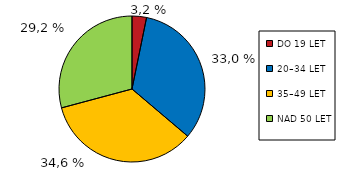
| Category | Series 0 |
|---|---|
| DO 19 LET | 17370 |
| 20–34 LET | 178752 |
| 35–49 LET | 187705 |
| NAD 50 LET | 158087 |